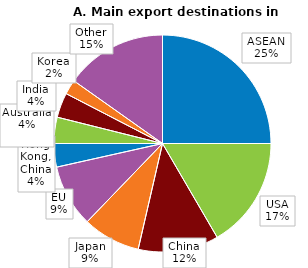
| Category | Series 0 |
|---|---|
| ASEAN | 25 |
| United States | 16.6 |
| China | 12 |
| Japan | 8.6 |
| EU | 9.3 |
| Hong Kong, China | 3.5 |
| Australia | 3.9 |
| India | 3.7 |
| Korea | 2.2 |
| Other | 15.2 |